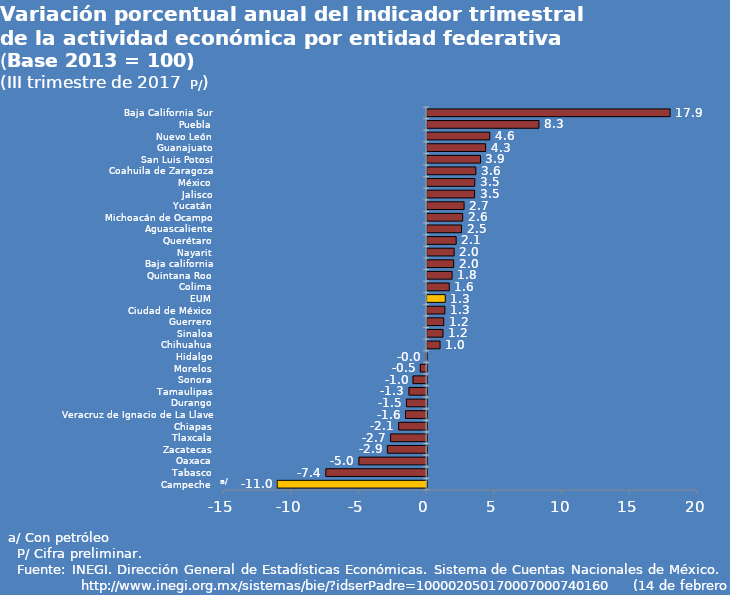
| Category | Series 0 |
|---|---|
| Campeche | -11.035 |
| Tabasco | -7.444 |
| Oaxaca | -5.001 |
| Zacatecas | -2.898 |
| Tlaxcala | -2.661 |
| Chiapas | -2.066 |
| Veracruz de Ignacio de La Llave | -1.557 |
| Durango | -1.493 |
| Tamaulipas | -1.305 |
| Sonora | -1.007 |
| Morelos | -0.468 |
| Hidalgo | -0.037 |
| Chihuahua | 0.952 |
| Sinaloa | 1.169 |
| Guerrero | 1.227 |
| Ciudad de México | 1.312 |
| EUM | 1.338 |
| Colima | 1.634 |
| Quintana Roo | 1.843 |
| Baja california | 1.957 |
| Nayarit | 1.995 |
| Querétaro | 2.145 |
| Aguascaliente | 2.539 |
| Michoacán de Ocampo | 2.624 |
| Yucatán | 2.728 |
| Jalisco | 3.508 |
| México | 3.52 |
| Coahuila de Zaragoza | 3.595 |
| San Luis Potosí | 3.937 |
| Guanajuato | 4.317 |
| Nuevo León | 4.626 |
| Puebla | 8.259 |
| Baja California Sur | 17.939 |